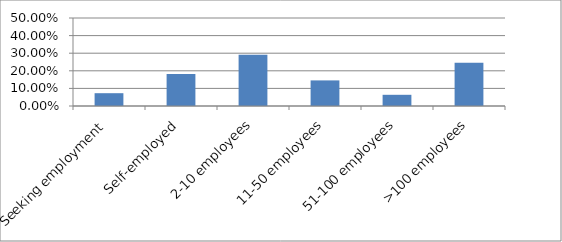
| Category | Series 0 |
|---|---|
| Seeking employment | 0.073 |
| Self-employed | 0.182 |
| 2-10 employees | 0.291 |
| 11-50 employees | 0.145 |
| 51-100 employees | 0.064 |
| >100 employees | 0.245 |